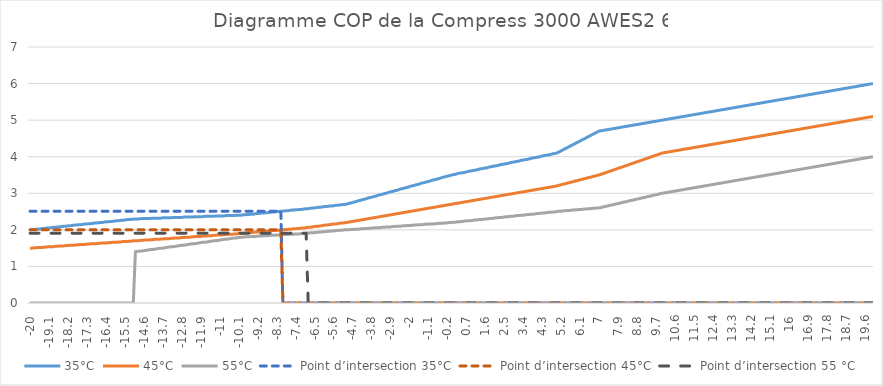
| Category | 35°C | 45°C | 55°C | Point d’intersection 35°C | Point d’intersection 45°C | Point d’intersection 55 °C |
|---|---|---|---|---|---|---|
| -20.0 | 2 | 1.5 | 0 | 2.51 | 2 | 1.91 |
| -19.9 | 2.01 | 1.5 | 0 | 2.51 | 2 | 1.91 |
| -19.8 | 2.01 | 1.51 | 0 | 2.51 | 2 | 1.91 |
| -19.7 | 2.02 | 1.51 | 0 | 2.51 | 2 | 1.91 |
| -19.6 | 2.02 | 1.52 | 0 | 2.51 | 2 | 1.91 |
| -19.5 | 2.03 | 1.52 | 0 | 2.51 | 2 | 1.91 |
| -19.4 | 2.04 | 1.52 | 0 | 2.51 | 2 | 1.91 |
| -19.3 | 2.04 | 1.53 | 0 | 2.51 | 2 | 1.91 |
| -19.2 | 2.05 | 1.53 | 0 | 2.51 | 2 | 1.91 |
| -19.1 | 2.05 | 1.54 | 0 | 2.51 | 2 | 1.91 |
| -19.0 | 2.06 | 1.54 | 0 | 2.51 | 2 | 1.91 |
| -18.9 | 2.07 | 1.54 | 0 | 2.51 | 2 | 1.91 |
| -18.8 | 2.07 | 1.55 | 0 | 2.51 | 2 | 1.91 |
| -18.7 | 2.08 | 1.55 | 0 | 2.51 | 2 | 1.91 |
| -18.6 | 2.08 | 1.56 | 0 | 2.51 | 2 | 1.91 |
| -18.5 | 2.09 | 1.56 | 0 | 2.51 | 2 | 1.91 |
| -18.4 | 2.1 | 1.56 | 0 | 2.51 | 2 | 1.91 |
| -18.3 | 2.1 | 1.57 | 0 | 2.51 | 2 | 1.91 |
| -18.2 | 2.11 | 1.57 | 0 | 2.51 | 2 | 1.91 |
| -18.1 | 2.11 | 1.58 | 0 | 2.51 | 2 | 1.91 |
| -18.0 | 2.12 | 1.58 | 0 | 2.51 | 2 | 1.91 |
| -17.9 | 2.13 | 1.58 | 0 | 2.51 | 2 | 1.91 |
| -17.8 | 2.13 | 1.59 | 0 | 2.51 | 2 | 1.91 |
| -17.7 | 2.14 | 1.59 | 0 | 2.51 | 2 | 1.91 |
| -17.6 | 2.14 | 1.6 | 0 | 2.51 | 2 | 1.91 |
| -17.5 | 2.15 | 1.6 | 0 | 2.51 | 2 | 1.91 |
| -17.4 | 2.16 | 1.6 | 0 | 2.51 | 2 | 1.91 |
| -17.3 | 2.16 | 1.61 | 0 | 2.51 | 2 | 1.91 |
| -17.2 | 2.17 | 1.61 | 0 | 2.51 | 2 | 1.91 |
| -17.1 | 2.17 | 1.62 | 0 | 2.51 | 2 | 1.91 |
| -17.0 | 2.18 | 1.62 | 0 | 2.51 | 2 | 1.91 |
| -16.9 | 2.19 | 1.62 | 0 | 2.51 | 2 | 1.91 |
| -16.8 | 2.19 | 1.63 | 0 | 2.51 | 2 | 1.91 |
| -16.7 | 2.2 | 1.63 | 0 | 2.51 | 2 | 1.91 |
| -16.6 | 2.2 | 1.64 | 0 | 2.51 | 2 | 1.91 |
| -16.5 | 2.21 | 1.64 | 0 | 2.51 | 2 | 1.91 |
| -16.4 | 2.22 | 1.64 | 0 | 2.51 | 2 | 1.91 |
| -16.3 | 2.22 | 1.65 | 0 | 2.51 | 2 | 1.91 |
| -16.2 | 2.23 | 1.65 | 0 | 2.51 | 2 | 1.91 |
| -16.1 | 2.23 | 1.66 | 0 | 2.51 | 2 | 1.91 |
| -16.0 | 2.24 | 1.66 | 0 | 2.51 | 2 | 1.91 |
| -15.9 | 2.25 | 1.66 | 0 | 2.51 | 2 | 1.91 |
| -15.8 | 2.25 | 1.67 | 0 | 2.51 | 2 | 1.91 |
| -15.7 | 2.26 | 1.67 | 0 | 2.51 | 2 | 1.91 |
| -15.6 | 2.26 | 1.68 | 0 | 2.51 | 2 | 1.91 |
| -15.5 | 2.27 | 1.68 | 0 | 2.51 | 2 | 1.91 |
| -15.4 | 2.28 | 1.68 | 0 | 2.51 | 2 | 1.91 |
| -15.3 | 2.28 | 1.69 | 0 | 2.51 | 2 | 1.91 |
| -15.2 | 2.29 | 1.69 | 0 | 2.51 | 2 | 1.91 |
| -15.1 | 2.29 | 1.7 | 0 | 2.51 | 2 | 1.91 |
| -15.0 | 2.3 | 1.7 | 1.4 | 2.51 | 2 | 1.91 |
| -14.9 | 2.3 | 1.7 | 1.41 | 2.51 | 2 | 1.91 |
| -14.8 | 2.3 | 1.71 | 1.42 | 2.51 | 2 | 1.91 |
| -14.7 | 2.31 | 1.71 | 1.42 | 2.51 | 2 | 1.91 |
| -14.6 | 2.31 | 1.72 | 1.43 | 2.51 | 2 | 1.91 |
| -14.5 | 2.31 | 1.72 | 1.44 | 2.51 | 2 | 1.91 |
| -14.4 | 2.31 | 1.72 | 1.45 | 2.51 | 2 | 1.91 |
| -14.3 | 2.31 | 1.73 | 1.46 | 2.51 | 2 | 1.91 |
| -14.2 | 2.32 | 1.73 | 1.46 | 2.51 | 2 | 1.91 |
| -14.1 | 2.32 | 1.74 | 1.47 | 2.51 | 2 | 1.91 |
| -14.0 | 2.32 | 1.74 | 1.48 | 2.51 | 2 | 1.91 |
| -13.9 | 2.32 | 1.74 | 1.49 | 2.51 | 2 | 1.91 |
| -13.8 | 2.32 | 1.75 | 1.5 | 2.51 | 2 | 1.91 |
| -13.7 | 2.33 | 1.75 | 1.5 | 2.51 | 2 | 1.91 |
| -13.6 | 2.33 | 1.76 | 1.51 | 2.51 | 2 | 1.91 |
| -13.5 | 2.33 | 1.76 | 1.52 | 2.51 | 2 | 1.91 |
| -13.4 | 2.33 | 1.76 | 1.53 | 2.51 | 2 | 1.91 |
| -13.3 | 2.33 | 1.77 | 1.54 | 2.51 | 2 | 1.91 |
| -13.2 | 2.34 | 1.77 | 1.54 | 2.51 | 2 | 1.91 |
| -13.1 | 2.34 | 1.78 | 1.55 | 2.51 | 2 | 1.91 |
| -13.0 | 2.34 | 1.78 | 1.56 | 2.51 | 2 | 1.91 |
| -12.9 | 2.34 | 1.78 | 1.57 | 2.51 | 2 | 1.91 |
| -12.8 | 2.34 | 1.79 | 1.58 | 2.51 | 2 | 1.91 |
| -12.7 | 2.35 | 1.79 | 1.58 | 2.51 | 2 | 1.91 |
| -12.6 | 2.35 | 1.8 | 1.59 | 2.51 | 2 | 1.91 |
| -12.5 | 2.35 | 1.8 | 1.6 | 2.51 | 2 | 1.91 |
| -12.4 | 2.35 | 1.8 | 1.61 | 2.51 | 2 | 1.91 |
| -12.3 | 2.35 | 1.81 | 1.62 | 2.51 | 2 | 1.91 |
| -12.2 | 2.36 | 1.81 | 1.62 | 2.51 | 2 | 1.91 |
| -12.1 | 2.36 | 1.82 | 1.63 | 2.51 | 2 | 1.91 |
| -12.0 | 2.36 | 1.82 | 1.64 | 2.51 | 2 | 1.91 |
| -11.9 | 2.36 | 1.82 | 1.65 | 2.51 | 2 | 1.91 |
| -11.8 | 2.36 | 1.83 | 1.66 | 2.51 | 2 | 1.91 |
| -11.7 | 2.37 | 1.83 | 1.66 | 2.51 | 2 | 1.91 |
| -11.6 | 2.37 | 1.84 | 1.67 | 2.51 | 2 | 1.91 |
| -11.5 | 2.37 | 1.84 | 1.68 | 2.51 | 2 | 1.91 |
| -11.4 | 2.37 | 1.84 | 1.69 | 2.51 | 2 | 1.91 |
| -11.3 | 2.37 | 1.85 | 1.7 | 2.51 | 2 | 1.91 |
| -11.2 | 2.38 | 1.85 | 1.7 | 2.51 | 2 | 1.91 |
| -11.1 | 2.38 | 1.86 | 1.71 | 2.51 | 2 | 1.91 |
| -11.0 | 2.38 | 1.86 | 1.72 | 2.51 | 2 | 1.91 |
| -10.9 | 2.38 | 1.86 | 1.73 | 2.51 | 2 | 1.91 |
| -10.8 | 2.38 | 1.87 | 1.74 | 2.51 | 2 | 1.91 |
| -10.7 | 2.39 | 1.87 | 1.74 | 2.51 | 2 | 1.91 |
| -10.6 | 2.39 | 1.88 | 1.75 | 2.51 | 2 | 1.91 |
| -10.5 | 2.39 | 1.88 | 1.76 | 2.51 | 2 | 1.91 |
| -10.4 | 2.39 | 1.88 | 1.77 | 2.51 | 2 | 1.91 |
| -10.3 | 2.39 | 1.89 | 1.78 | 2.51 | 2 | 1.91 |
| -10.2 | 2.4 | 1.89 | 1.78 | 2.51 | 2 | 1.91 |
| -10.1 | 2.4 | 1.9 | 1.79 | 2.51 | 2 | 1.91 |
| -10.0 | 2.4 | 1.9 | 1.8 | 2.51 | 2 | 1.91 |
| -9.9 | 2.41 | 1.91 | 1.8 | 2.51 | 2 | 1.91 |
| -9.8 | 2.41 | 1.91 | 1.81 | 2.51 | 2 | 1.91 |
| -9.7 | 2.42 | 1.92 | 1.81 | 2.51 | 2 | 1.91 |
| -9.6 | 2.42 | 1.92 | 1.81 | 2.51 | 2 | 1.91 |
| -9.5 | 2.43 | 1.93 | 1.82 | 2.51 | 2 | 1.91 |
| -9.4 | 2.43 | 1.93 | 1.82 | 2.51 | 2 | 1.91 |
| -9.3 | 2.44 | 1.94 | 1.82 | 2.51 | 2 | 1.91 |
| -9.2 | 2.45 | 1.94 | 1.83 | 2.51 | 2 | 1.91 |
| -9.1 | 2.45 | 1.95 | 1.83 | 2.51 | 2 | 1.91 |
| -9.0 | 2.46 | 1.95 | 1.83 | 2.51 | 2 | 1.91 |
| -8.9 | 2.46 | 1.96 | 1.84 | 2.51 | 2 | 1.91 |
| -8.8 | 2.47 | 1.96 | 1.84 | 2.51 | 2 | 1.91 |
| -8.7 | 2.47 | 1.97 | 1.84 | 2.51 | 2 | 1.91 |
| -8.6 | 2.48 | 1.97 | 1.85 | 2.51 | 2 | 1.91 |
| -8.5 | 2.49 | 1.98 | 1.85 | 2.51 | 2 | 1.91 |
| -8.4 | 2.49 | 1.98 | 1.85 | 2.51 | 2 | 1.91 |
| -8.3 | 2.5 | 1.99 | 1.86 | 2.51 | 2 | 1.91 |
| -8.2 | 2.5 | 1.99 | 1.86 | 2.51 | 2 | 1.91 |
| -8.1 | 2.51 | 2 | 1.86 | 2.51 | 2 | 1.91 |
| -8.0 | 2.51 | 2 | 1.87 | 0 | 0 | 1.91 |
| -7.9 | 2.52 | 2.01 | 1.87 | 0 | 0 | 1.91 |
| -7.8 | 2.52 | 2.01 | 1.87 | 0 | 0 | 1.91 |
| -7.7 | 2.53 | 2.02 | 1.88 | 0 | 0 | 1.91 |
| -7.6 | 2.54 | 2.02 | 1.88 | 0 | 0 | 1.91 |
| -7.5 | 2.54 | 2.03 | 1.88 | 0 | 0 | 1.91 |
| -7.4 | 2.55 | 2.03 | 1.89 | 0 | 0 | 1.91 |
| -7.3 | 2.55 | 2.04 | 1.89 | 0 | 0 | 1.91 |
| -7.2 | 2.56 | 2.04 | 1.89 | 0 | 0 | 1.91 |
| -7.1 | 2.56 | 2.05 | 1.9 | 0 | 0 | 1.91 |
| -7.0 | 2.57 | 2.05 | 1.9 | 0 | 0 | 1.91 |
| -6.9 | 2.58 | 2.06 | 1.91 | 0 | 0 | 1.91 |
| -6.8 | 2.58 | 2.07 | 1.91 | 0 | 0 | 0 |
| -6.7 | 2.59 | 2.07 | 1.92 | 0 | 0 | 0 |
| -6.6 | 2.6 | 2.08 | 1.92 | 0 | 0 | 0 |
| -6.5 | 2.6 | 2.09 | 1.93 | 0 | 0 | 0 |
| -6.4 | 2.61 | 2.1 | 1.93 | 0 | 0 | 0 |
| -6.3 | 2.62 | 2.1 | 1.94 | 0 | 0 | 0 |
| -6.2 | 2.62 | 2.11 | 1.94 | 0 | 0 | 0 |
| -6.1 | 2.63 | 2.12 | 1.95 | 0 | 0 | 0 |
| -6.0 | 2.64 | 2.13 | 1.95 | 0 | 0 | 0 |
| -5.9 | 2.64 | 2.13 | 1.96 | 0 | 0 | 0 |
| -5.8 | 2.65 | 2.14 | 1.96 | 0 | 0 | 0 |
| -5.7 | 2.65 | 2.15 | 1.97 | 0 | 0 | 0 |
| -5.6 | 2.66 | 2.16 | 1.97 | 0 | 0 | 0 |
| -5.5 | 2.67 | 2.16 | 1.98 | 0 | 0 | 0 |
| -5.4 | 2.67 | 2.17 | 1.98 | 0 | 0 | 0 |
| -5.3 | 2.68 | 2.18 | 1.99 | 0 | 0 | 0 |
| -5.2 | 2.69 | 2.19 | 1.99 | 0 | 0 | 0 |
| -5.1 | 2.69 | 2.19 | 2 | 0 | 0 | 0 |
| -5.0 | 2.7 | 2.2 | 2 | 0 | 0 | 0 |
| -4.9 | 2.72 | 2.21 | 2 | 0 | 0 | 0 |
| -4.8 | 2.73 | 2.22 | 2.01 | 0 | 0 | 0 |
| -4.7 | 2.75 | 2.23 | 2.01 | 0 | 0 | 0 |
| -4.6 | 2.76 | 2.24 | 2.02 | 0 | 0 | 0 |
| -4.5 | 2.78 | 2.25 | 2.02 | 0 | 0 | 0 |
| -4.4 | 2.8 | 2.26 | 2.02 | 0 | 0 | 0 |
| -4.3 | 2.81 | 2.27 | 2.03 | 0 | 0 | 0 |
| -4.2 | 2.83 | 2.28 | 2.03 | 0 | 0 | 0 |
| -4.1 | 2.84 | 2.29 | 2.04 | 0 | 0 | 0 |
| -4.0 | 2.86 | 2.3 | 2.04 | 0 | 0 | 0 |
| -3.9 | 2.88 | 2.31 | 2.04 | 0 | 0 | 0 |
| -3.8 | 2.89 | 2.32 | 2.05 | 0 | 0 | 0 |
| -3.7 | 2.91 | 2.33 | 2.05 | 0 | 0 | 0 |
| -3.6 | 2.92 | 2.34 | 2.06 | 0 | 0 | 0 |
| -3.5 | 2.94 | 2.35 | 2.06 | 0 | 0 | 0 |
| -3.4 | 2.96 | 2.36 | 2.06 | 0 | 0 | 0 |
| -3.3 | 2.97 | 2.37 | 2.07 | 0 | 0 | 0 |
| -3.2 | 2.99 | 2.38 | 2.07 | 0 | 0 | 0 |
| -3.1 | 3 | 2.39 | 2.08 | 0 | 0 | 0 |
| -3.0 | 3.02 | 2.4 | 2.08 | 0 | 0 | 0 |
| -2.9 | 3.04 | 2.41 | 2.08 | 0 | 0 | 0 |
| -2.8 | 3.05 | 2.42 | 2.09 | 0 | 0 | 0 |
| -2.7 | 3.07 | 2.43 | 2.09 | 0 | 0 | 0 |
| -2.6 | 3.08 | 2.44 | 2.1 | 0 | 0 | 0 |
| -2.5 | 3.1 | 2.45 | 2.1 | 0 | 0 | 0 |
| -2.4 | 3.12 | 2.46 | 2.1 | 0 | 0 | 0 |
| -2.3 | 3.13 | 2.47 | 2.11 | 0 | 0 | 0 |
| -2.2 | 3.15 | 2.48 | 2.11 | 0 | 0 | 0 |
| -2.1 | 3.16 | 2.49 | 2.12 | 0 | 0 | 0 |
| -2.0 | 3.18 | 2.5 | 2.12 | 0 | 0 | 0 |
| -1.9 | 3.2 | 2.51 | 2.12 | 0 | 0 | 0 |
| -1.8 | 3.21 | 2.52 | 2.13 | 0 | 0 | 0 |
| -1.7 | 3.23 | 2.53 | 2.13 | 0 | 0 | 0 |
| -1.6 | 3.24 | 2.54 | 2.14 | 0 | 0 | 0 |
| -1.5 | 3.26 | 2.55 | 2.14 | 0 | 0 | 0 |
| -1.4 | 3.28 | 2.56 | 2.14 | 0 | 0 | 0 |
| -1.3 | 3.29 | 2.57 | 2.15 | 0 | 0 | 0 |
| -1.2 | 3.31 | 2.58 | 2.15 | 0 | 0 | 0 |
| -1.1 | 3.32 | 2.59 | 2.16 | 0 | 0 | 0 |
| -1.0 | 3.34 | 2.6 | 2.16 | 0 | 0 | 0 |
| -0.9 | 3.36 | 2.61 | 2.16 | 0 | 0 | 0 |
| -0.8 | 3.37 | 2.62 | 2.17 | 0 | 0 | 0 |
| -0.7 | 3.39 | 2.63 | 2.17 | 0 | 0 | 0 |
| -0.6 | 3.4 | 2.64 | 2.18 | 0 | 0 | 0 |
| -0.5 | 3.42 | 2.65 | 2.18 | 0 | 0 | 0 |
| -0.4 | 3.44 | 2.66 | 2.18 | 0 | 0 | 0 |
| -0.3 | 3.45 | 2.67 | 2.19 | 0 | 0 | 0 |
| -0.2 | 3.47 | 2.68 | 2.19 | 0 | 0 | 0 |
| -0.1 | 3.48 | 2.69 | 2.2 | 0 | 0 | 0 |
| 0.0 | 3.5 | 2.7 | 2.2 | 0 | 0 | 0 |
| 0.1 | 3.51 | 2.71 | 2.21 | 0 | 0 | 0 |
| 0.2 | 3.52 | 2.72 | 2.21 | 0 | 0 | 0 |
| 0.3 | 3.54 | 2.73 | 2.22 | 0 | 0 | 0 |
| 0.4 | 3.55 | 2.74 | 2.22 | 0 | 0 | 0 |
| 0.5 | 3.56 | 2.75 | 2.23 | 0 | 0 | 0 |
| 0.6 | 3.57 | 2.76 | 2.24 | 0 | 0 | 0 |
| 0.7 | 3.58 | 2.77 | 2.24 | 0 | 0 | 0 |
| 0.8 | 3.6 | 2.78 | 2.25 | 0 | 0 | 0 |
| 0.9 | 3.61 | 2.79 | 2.25 | 0 | 0 | 0 |
| 1.0 | 3.62 | 2.8 | 2.26 | 0 | 0 | 0 |
| 1.1 | 3.63 | 2.81 | 2.27 | 0 | 0 | 0 |
| 1.2 | 3.64 | 2.82 | 2.27 | 0 | 0 | 0 |
| 1.3 | 3.66 | 2.83 | 2.28 | 0 | 0 | 0 |
| 1.4 | 3.67 | 2.84 | 2.28 | 0 | 0 | 0 |
| 1.5 | 3.68 | 2.85 | 2.29 | 0 | 0 | 0 |
| 1.6 | 3.69 | 2.86 | 2.3 | 0 | 0 | 0 |
| 1.7 | 3.7 | 2.87 | 2.3 | 0 | 0 | 0 |
| 1.8 | 3.72 | 2.88 | 2.31 | 0 | 0 | 0 |
| 1.9 | 3.73 | 2.89 | 2.31 | 0 | 0 | 0 |
| 2.0 | 3.74 | 2.9 | 2.32 | 0 | 0 | 0 |
| 2.1 | 3.75 | 2.91 | 2.33 | 0 | 0 | 0 |
| 2.2 | 3.76 | 2.92 | 2.33 | 0 | 0 | 0 |
| 2.3 | 3.78 | 2.93 | 2.34 | 0 | 0 | 0 |
| 2.4 | 3.79 | 2.94 | 2.34 | 0 | 0 | 0 |
| 2.5 | 3.8 | 2.95 | 2.35 | 0 | 0 | 0 |
| 2.6 | 3.81 | 2.96 | 2.36 | 0 | 0 | 0 |
| 2.7 | 3.82 | 2.97 | 2.36 | 0 | 0 | 0 |
| 2.8 | 3.84 | 2.98 | 2.37 | 0 | 0 | 0 |
| 2.9 | 3.85 | 2.99 | 2.37 | 0 | 0 | 0 |
| 3.0 | 3.86 | 3 | 2.38 | 0 | 0 | 0 |
| 3.1 | 3.87 | 3.01 | 2.39 | 0 | 0 | 0 |
| 3.2 | 3.88 | 3.02 | 2.39 | 0 | 0 | 0 |
| 3.3 | 3.9 | 3.03 | 2.4 | 0 | 0 | 0 |
| 3.4 | 3.91 | 3.04 | 2.4 | 0 | 0 | 0 |
| 3.5 | 3.92 | 3.05 | 2.41 | 0 | 0 | 0 |
| 3.6 | 3.93 | 3.06 | 2.42 | 0 | 0 | 0 |
| 3.7 | 3.94 | 3.07 | 2.42 | 0 | 0 | 0 |
| 3.8 | 3.96 | 3.08 | 2.43 | 0 | 0 | 0 |
| 3.9 | 3.97 | 3.09 | 2.43 | 0 | 0 | 0 |
| 4.0 | 3.98 | 3.1 | 2.44 | 0 | 0 | 0 |
| 4.1 | 3.99 | 3.11 | 2.45 | 0 | 0 | 0 |
| 4.2 | 4 | 3.12 | 2.45 | 0 | 0 | 0 |
| 4.3 | 4.02 | 3.13 | 2.46 | 0 | 0 | 0 |
| 4.4 | 4.03 | 3.14 | 2.46 | 0 | 0 | 0 |
| 4.5 | 4.04 | 3.15 | 2.47 | 0 | 0 | 0 |
| 4.6 | 4.05 | 3.16 | 2.48 | 0 | 0 | 0 |
| 4.7 | 4.06 | 3.17 | 2.48 | 0 | 0 | 0 |
| 4.8 | 4.08 | 3.18 | 2.49 | 0 | 0 | 0 |
| 4.9 | 4.09 | 3.19 | 2.49 | 0 | 0 | 0 |
| 5.0 | 4.1 | 3.2 | 2.5 | 0 | 0 | 0 |
| 5.1 | 4.13 | 3.22 | 2.51 | 0 | 0 | 0 |
| 5.2 | 4.16 | 3.23 | 2.51 | 0 | 0 | 0 |
| 5.3 | 4.19 | 3.25 | 2.52 | 0 | 0 | 0 |
| 5.4 | 4.22 | 3.26 | 2.52 | 0 | 0 | 0 |
| 5.5 | 4.25 | 3.28 | 2.53 | 0 | 0 | 0 |
| 5.6 | 4.28 | 3.29 | 2.53 | 0 | 0 | 0 |
| 5.7 | 4.31 | 3.31 | 2.54 | 0 | 0 | 0 |
| 5.8 | 4.34 | 3.32 | 2.54 | 0 | 0 | 0 |
| 5.9 | 4.37 | 3.34 | 2.55 | 0 | 0 | 0 |
| 6.0 | 4.4 | 3.35 | 2.55 | 0 | 0 | 0 |
| 6.1 | 4.43 | 3.37 | 2.56 | 0 | 0 | 0 |
| 6.2 | 4.46 | 3.38 | 2.56 | 0 | 0 | 0 |
| 6.3 | 4.49 | 3.4 | 2.57 | 0 | 0 | 0 |
| 6.4 | 4.52 | 3.41 | 2.57 | 0 | 0 | 0 |
| 6.5 | 4.55 | 3.43 | 2.58 | 0 | 0 | 0 |
| 6.6 | 4.58 | 3.44 | 2.58 | 0 | 0 | 0 |
| 6.7 | 4.61 | 3.46 | 2.59 | 0 | 0 | 0 |
| 6.8 | 4.64 | 3.47 | 2.59 | 0 | 0 | 0 |
| 6.9 | 4.67 | 3.49 | 2.6 | 0 | 0 | 0 |
| 7.0 | 4.7 | 3.5 | 2.6 | 0 | 0 | 0 |
| 7.1 | 4.71 | 3.52 | 2.61 | 0 | 0 | 0 |
| 7.2 | 4.72 | 3.54 | 2.63 | 0 | 0 | 0 |
| 7.3 | 4.73 | 3.56 | 2.64 | 0 | 0 | 0 |
| 7.4 | 4.74 | 3.58 | 2.65 | 0 | 0 | 0 |
| 7.5 | 4.75 | 3.6 | 2.67 | 0 | 0 | 0 |
| 7.6 | 4.76 | 3.62 | 2.68 | 0 | 0 | 0 |
| 7.7 | 4.77 | 3.64 | 2.69 | 0 | 0 | 0 |
| 7.8 | 4.78 | 3.66 | 2.71 | 0 | 0 | 0 |
| 7.9 | 4.79 | 3.68 | 2.72 | 0 | 0 | 0 |
| 8.0 | 4.8 | 3.7 | 2.73 | 0 | 0 | 0 |
| 8.1 | 4.81 | 3.72 | 2.75 | 0 | 0 | 0 |
| 8.2 | 4.82 | 3.74 | 2.76 | 0 | 0 | 0 |
| 8.3 | 4.83 | 3.76 | 2.77 | 0 | 0 | 0 |
| 8.4 | 4.84 | 3.78 | 2.79 | 0 | 0 | 0 |
| 8.5 | 4.85 | 3.8 | 2.8 | 0 | 0 | 0 |
| 8.6 | 4.86 | 3.82 | 2.81 | 0 | 0 | 0 |
| 8.7 | 4.87 | 3.84 | 2.83 | 0 | 0 | 0 |
| 8.8 | 4.88 | 3.86 | 2.84 | 0 | 0 | 0 |
| 8.9 | 4.89 | 3.88 | 2.85 | 0 | 0 | 0 |
| 9.0 | 4.9 | 3.9 | 2.87 | 0 | 0 | 0 |
| 9.1 | 4.91 | 3.92 | 2.88 | 0 | 0 | 0 |
| 9.2 | 4.92 | 3.94 | 2.89 | 0 | 0 | 0 |
| 9.3 | 4.93 | 3.96 | 2.91 | 0 | 0 | 0 |
| 9.4 | 4.94 | 3.98 | 2.92 | 0 | 0 | 0 |
| 9.5 | 4.95 | 4 | 2.93 | 0 | 0 | 0 |
| 9.6 | 4.96 | 4.02 | 2.95 | 0 | 0 | 0 |
| 9.7 | 4.97 | 4.04 | 2.96 | 0 | 0 | 0 |
| 9.8 | 4.98 | 4.06 | 2.97 | 0 | 0 | 0 |
| 9.9 | 4.99 | 4.08 | 2.99 | 0 | 0 | 0 |
| 10.0 | 5 | 4.1 | 3 | 0 | 0 | 0 |
| 10.1 | 5.01 | 4.11 | 3.01 | 0 | 0 | 0 |
| 10.2 | 5.02 | 4.12 | 3.02 | 0 | 0 | 0 |
| 10.3 | 5.03 | 4.13 | 3.03 | 0 | 0 | 0 |
| 10.4 | 5.04 | 4.14 | 3.04 | 0 | 0 | 0 |
| 10.5 | 5.05 | 4.15 | 3.05 | 0 | 0 | 0 |
| 10.6 | 5.06 | 4.16 | 3.06 | 0 | 0 | 0 |
| 10.7 | 5.07 | 4.17 | 3.07 | 0 | 0 | 0 |
| 10.8 | 5.08 | 4.18 | 3.08 | 0 | 0 | 0 |
| 10.9 | 5.09 | 4.19 | 3.09 | 0 | 0 | 0 |
| 11.0 | 5.1 | 4.2 | 3.1 | 0 | 0 | 0 |
| 11.1 | 5.11 | 4.21 | 3.11 | 0 | 0 | 0 |
| 11.2 | 5.12 | 4.22 | 3.12 | 0 | 0 | 0 |
| 11.3 | 5.13 | 4.23 | 3.13 | 0 | 0 | 0 |
| 11.4 | 5.14 | 4.24 | 3.14 | 0 | 0 | 0 |
| 11.5 | 5.15 | 4.25 | 3.15 | 0 | 0 | 0 |
| 11.6 | 5.16 | 4.26 | 3.16 | 0 | 0 | 0 |
| 11.7 | 5.17 | 4.27 | 3.17 | 0 | 0 | 0 |
| 11.8 | 5.18 | 4.28 | 3.18 | 0 | 0 | 0 |
| 11.9 | 5.19 | 4.29 | 3.19 | 0 | 0 | 0 |
| 12.0 | 5.2 | 4.3 | 3.2 | 0 | 0 | 0 |
| 12.1 | 5.21 | 4.31 | 3.21 | 0 | 0 | 0 |
| 12.2 | 5.22 | 4.32 | 3.22 | 0 | 0 | 0 |
| 12.3 | 5.23 | 4.33 | 3.23 | 0 | 0 | 0 |
| 12.4 | 5.24 | 4.34 | 3.24 | 0 | 0 | 0 |
| 12.5 | 5.25 | 4.35 | 3.25 | 0 | 0 | 0 |
| 12.6 | 5.26 | 4.36 | 3.26 | 0 | 0 | 0 |
| 12.7 | 5.27 | 4.37 | 3.27 | 0 | 0 | 0 |
| 12.8 | 5.28 | 4.38 | 3.28 | 0 | 0 | 0 |
| 12.9 | 5.29 | 4.39 | 3.29 | 0 | 0 | 0 |
| 13.0 | 5.3 | 4.4 | 3.3 | 0 | 0 | 0 |
| 13.1 | 5.31 | 4.41 | 3.31 | 0 | 0 | 0 |
| 13.2 | 5.32 | 4.42 | 3.32 | 0 | 0 | 0 |
| 13.3 | 5.33 | 4.43 | 3.33 | 0 | 0 | 0 |
| 13.4 | 5.34 | 4.44 | 3.34 | 0 | 0 | 0 |
| 13.5 | 5.35 | 4.45 | 3.35 | 0 | 0 | 0 |
| 13.6 | 5.36 | 4.46 | 3.36 | 0 | 0 | 0 |
| 13.7 | 5.37 | 4.47 | 3.37 | 0 | 0 | 0 |
| 13.8 | 5.38 | 4.48 | 3.38 | 0 | 0 | 0 |
| 13.9 | 5.39 | 4.49 | 3.39 | 0 | 0 | 0 |
| 14.0 | 5.4 | 4.5 | 3.4 | 0 | 0 | 0 |
| 14.1 | 5.41 | 4.51 | 3.41 | 0 | 0 | 0 |
| 14.2 | 5.42 | 4.52 | 3.42 | 0 | 0 | 0 |
| 14.3 | 5.43 | 4.53 | 3.43 | 0 | 0 | 0 |
| 14.4 | 5.44 | 4.54 | 3.44 | 0 | 0 | 0 |
| 14.5 | 5.45 | 4.55 | 3.45 | 0 | 0 | 0 |
| 14.6 | 5.46 | 4.56 | 3.46 | 0 | 0 | 0 |
| 14.7 | 5.47 | 4.57 | 3.47 | 0 | 0 | 0 |
| 14.8 | 5.48 | 4.58 | 3.48 | 0 | 0 | 0 |
| 14.9 | 5.49 | 4.59 | 3.49 | 0 | 0 | 0 |
| 15.0 | 5.5 | 4.6 | 3.5 | 0 | 0 | 0 |
| 15.1 | 5.51 | 4.61 | 3.51 | 0 | 0 | 0 |
| 15.2 | 5.52 | 4.62 | 3.52 | 0 | 0 | 0 |
| 15.3 | 5.53 | 4.63 | 3.53 | 0 | 0 | 0 |
| 15.4 | 5.54 | 4.64 | 3.54 | 0 | 0 | 0 |
| 15.5 | 5.55 | 4.65 | 3.55 | 0 | 0 | 0 |
| 15.6 | 5.56 | 4.66 | 3.56 | 0 | 0 | 0 |
| 15.7 | 5.57 | 4.67 | 3.57 | 0 | 0 | 0 |
| 15.8 | 5.58 | 4.68 | 3.58 | 0 | 0 | 0 |
| 15.9 | 5.59 | 4.69 | 3.59 | 0 | 0 | 0 |
| 16.0 | 5.6 | 4.7 | 3.6 | 0 | 0 | 0 |
| 16.1 | 5.61 | 4.71 | 3.61 | 0 | 0 | 0 |
| 16.2 | 5.62 | 4.72 | 3.62 | 0 | 0 | 0 |
| 16.3 | 5.63 | 4.73 | 3.63 | 0 | 0 | 0 |
| 16.4 | 5.64 | 4.74 | 3.64 | 0 | 0 | 0 |
| 16.5 | 5.65 | 4.75 | 3.65 | 0 | 0 | 0 |
| 16.6 | 5.66 | 4.76 | 3.66 | 0 | 0 | 0 |
| 16.7 | 5.67 | 4.77 | 3.67 | 0 | 0 | 0 |
| 16.8 | 5.68 | 4.78 | 3.68 | 0 | 0 | 0 |
| 16.9 | 5.69 | 4.79 | 3.69 | 0 | 0 | 0 |
| 17.0 | 5.7 | 4.8 | 3.7 | 0 | 0 | 0 |
| 17.1 | 5.71 | 4.81 | 3.71 | 0 | 0 | 0 |
| 17.2 | 5.72 | 4.82 | 3.72 | 0 | 0 | 0 |
| 17.3 | 5.73 | 4.83 | 3.73 | 0 | 0 | 0 |
| 17.4 | 5.74 | 4.84 | 3.74 | 0 | 0 | 0 |
| 17.5 | 5.75 | 4.85 | 3.75 | 0 | 0 | 0 |
| 17.6 | 5.76 | 4.86 | 3.76 | 0 | 0 | 0 |
| 17.7 | 5.77 | 4.87 | 3.77 | 0 | 0 | 0 |
| 17.8 | 5.78 | 4.88 | 3.78 | 0 | 0 | 0 |
| 17.9 | 5.79 | 4.89 | 3.79 | 0 | 0 | 0 |
| 18.0 | 5.8 | 4.9 | 3.8 | 0 | 0 | 0 |
| 18.1 | 5.81 | 4.91 | 3.81 | 0 | 0 | 0 |
| 18.2 | 5.82 | 4.92 | 3.82 | 0 | 0 | 0 |
| 18.3 | 5.83 | 4.93 | 3.83 | 0 | 0 | 0 |
| 18.4 | 5.84 | 4.94 | 3.84 | 0 | 0 | 0 |
| 18.5 | 5.85 | 4.95 | 3.85 | 0 | 0 | 0 |
| 18.6 | 5.86 | 4.96 | 3.86 | 0 | 0 | 0 |
| 18.7 | 5.87 | 4.97 | 3.87 | 0 | 0 | 0 |
| 18.8 | 5.88 | 4.98 | 3.88 | 0 | 0 | 0 |
| 18.9 | 5.89 | 4.99 | 3.89 | 0 | 0 | 0 |
| 19.0 | 5.9 | 5 | 3.9 | 0 | 0 | 0 |
| 19.1 | 5.91 | 5.01 | 3.91 | 0 | 0 | 0 |
| 19.2 | 5.92 | 5.02 | 3.92 | 0 | 0 | 0 |
| 19.3 | 5.93 | 5.03 | 3.93 | 0 | 0 | 0 |
| 19.4 | 5.94 | 5.04 | 3.94 | 0 | 0 | 0 |
| 19.5 | 5.95 | 5.05 | 3.95 | 0 | 0 | 0 |
| 19.6 | 5.96 | 5.06 | 3.96 | 0 | 0 | 0 |
| 19.7 | 5.97 | 5.07 | 3.97 | 0 | 0 | 0 |
| 19.8 | 5.98 | 5.08 | 3.98 | 0 | 0 | 0 |
| 19.9 | 5.99 | 5.09 | 3.99 | 0 | 0 | 0 |
| 20.0 | 6 | 5.1 | 4 | 0 | 0 | 0 |